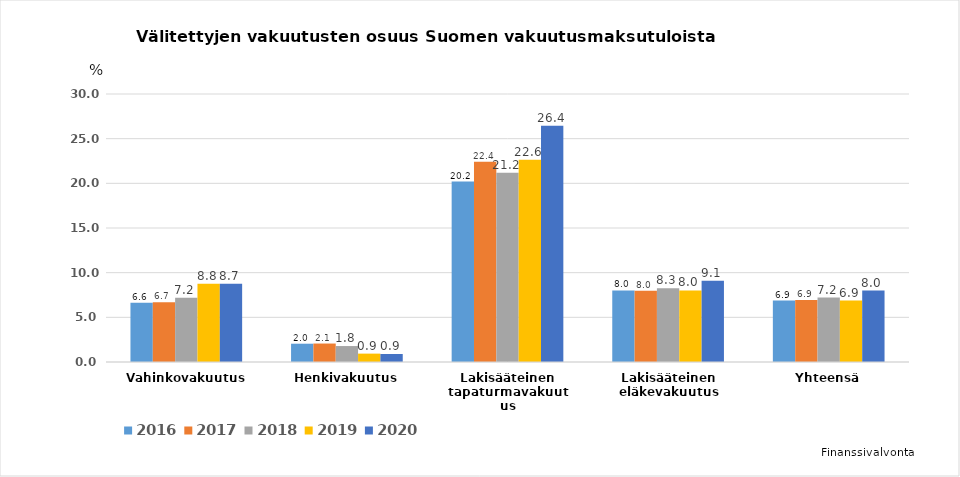
| Category | 2016 | 2017 | 2018 | 2019 | 2020 |
|---|---|---|---|---|---|
| Vahinkovakuutus | 6.621 | 6.681 | 7.184 | 8.751 | 8.75 |
| Henkivakuutus | 2.047 | 2.067 | 1.786 | 0.938 | 0.899 |
| Lakisääteinen tapaturmavakuutus | 20.194 | 22.408 | 21.186 | 22.632 | 26.436 |
| Lakisääteinen eläkevakuutus | 8.016 | 7.982 | 8.268 | 8.015 | 9.101 |
| Yhteensä | 6.875 | 6.948 | 7.208 | 6.878 | 8 |